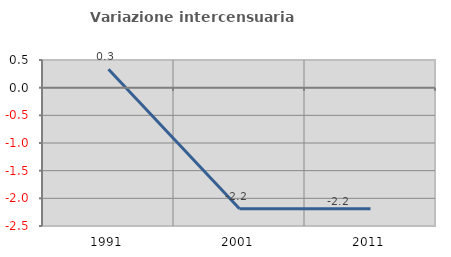
| Category | Variazione intercensuaria annua |
|---|---|
| 1991.0 | 0.332 |
| 2001.0 | -2.19 |
| 2011.0 | -2.188 |